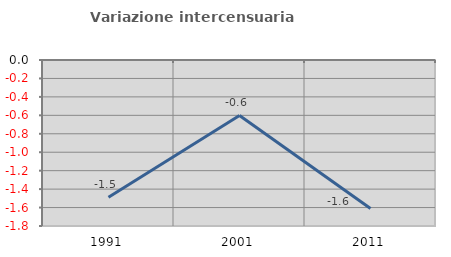
| Category | Variazione intercensuaria annua |
|---|---|
| 1991.0 | -1.488 |
| 2001.0 | -0.601 |
| 2011.0 | -1.611 |